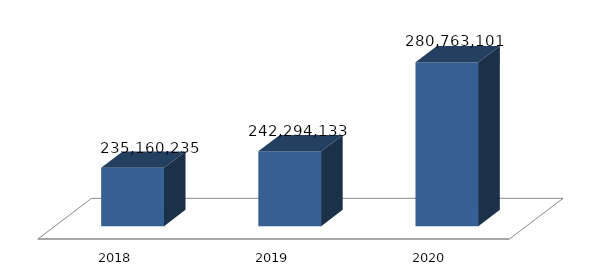
| Category | Dukungan Manajemen Dan Pelaksanaan Tugas Teknis Lainnya LPP TVRI |
|---|---|
| 2018.0 | 235160235 |
| 2019.0 | 242294133 |
| 2020.0 | 280763101 |